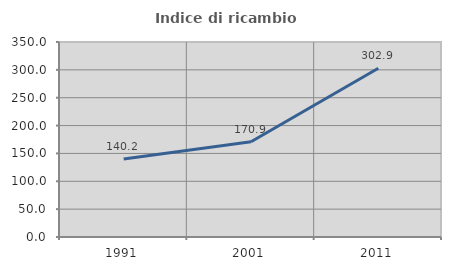
| Category | Indice di ricambio occupazionale  |
|---|---|
| 1991.0 | 140.183 |
| 2001.0 | 170.912 |
| 2011.0 | 302.867 |